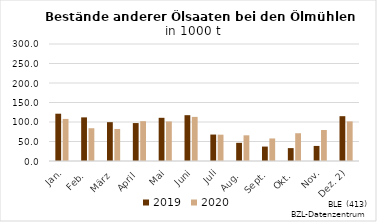
| Category | 2019 | 2020 |
|---|---|---|
| Jan. | 121.285 | 107.917 |
| Feb. | 111.865 | 84.029 |
| März | 99.587 | 82.18 |
| April | 97.271 | 102.122 |
| Mai | 110.764 | 101.495 |
| Juni | 117.475 | 113.119 |
| Juli | 67.796 | 67.453 |
| Aug. | 46.603 | 65.853 |
| Sept. | 36.986 | 57.798 |
| Okt. | 33.047 | 71.213 |
| Nov. | 38.646 | 79.55 |
| Dez. 2) | 114.909 | 101.589 |